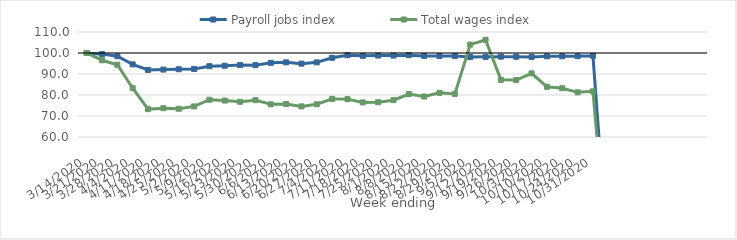
| Category | Payroll jobs index | Total wages index |
|---|---|---|
| 14/03/2020 | 100 | 100 |
| 21/03/2020 | 99.46 | 96.561 |
| 28/03/2020 | 98.457 | 94.41 |
| 04/04/2020 | 94.585 | 83.237 |
| 11/04/2020 | 91.928 | 73.264 |
| 18/04/2020 | 92.109 | 73.733 |
| 25/04/2020 | 92.268 | 73.446 |
| 02/05/2020 | 92.388 | 74.566 |
| 09/05/2020 | 93.716 | 77.745 |
| 16/05/2020 | 93.93 | 77.35 |
| 23/05/2020 | 94.227 | 76.775 |
| 30/05/2020 | 94.225 | 77.543 |
| 06/06/2020 | 95.331 | 75.578 |
| 13/06/2020 | 95.553 | 75.745 |
| 20/06/2020 | 94.923 | 74.578 |
| 27/06/2020 | 95.545 | 75.609 |
| 04/07/2020 | 97.712 | 78.149 |
| 11/07/2020 | 98.932 | 78.037 |
| 18/07/2020 | 98.636 | 76.46 |
| 25/07/2020 | 98.778 | 76.561 |
| 01/08/2020 | 98.775 | 77.538 |
| 08/08/2020 | 98.966 | 80.421 |
| 15/08/2020 | 98.612 | 79.273 |
| 22/08/2020 | 98.553 | 81.036 |
| 29/08/2020 | 98.542 | 80.532 |
| 05/09/2020 | 98.104 | 104.01 |
| 12/09/2020 | 98.173 | 106.314 |
| 19/09/2020 | 98.261 | 87.221 |
| 26/09/2020 | 98.215 | 87.112 |
| 03/10/2020 | 98.136 | 90.317 |
| 10/10/2020 | 98.416 | 83.924 |
| 17/10/2020 | 98.44 | 83.203 |
| 24/10/2020 | 98.481 | 81.267 |
| 31/10/2020 | 98.684 | 81.77 |